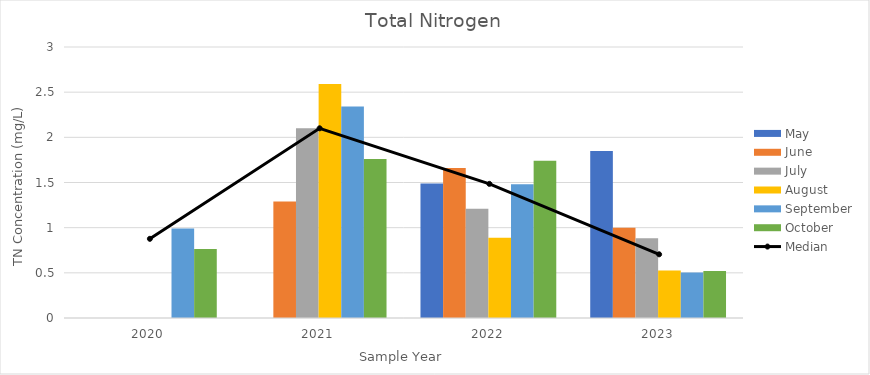
| Category | May | June | July | August | September | October |
|---|---|---|---|---|---|---|
| 2020.0 | 0 | 0 | 0 | 0 | 0.99 | 0.763 |
| 2021.0 | 0 | 1.29 | 2.1 | 2.59 | 2.34 | 1.76 |
| 2022.0 | 1.49 | 1.66 | 1.21 | 0.888 | 1.48 | 1.74 |
| 2023.0 | 1.85 | 0.999 | 0.883 | 0.527 | 0.505 | 0.521 |